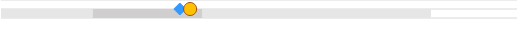
| Category | left | mid start | mid end | right |
|---|---|---|---|---|
| 0 | 0 | 0.213 | 0.255 | 0.531 |